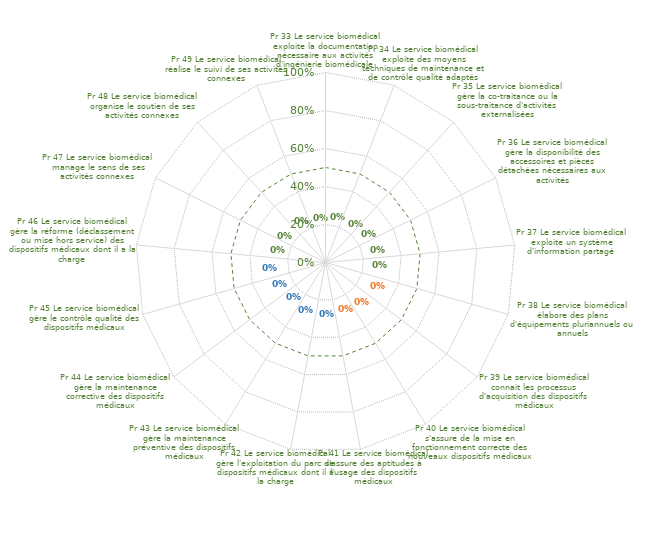
| Category | Graphes RADAR pour Résultats Globaux BPR | Limite ISO 17050 |
|---|---|---|
| Pr 33 Le service biomédical exploite la documentation nécessaire aux activités d'ingénierie biomédicale | 0 | 0.5 |
| Pr 34 Le service biomédical exploite des moyens techniques de maintenance et de contrôle qualité adaptés | 0 | 0.5 |
| Pr 35 Le service biomédical gère la co-traitance ou la sous-traitance d'activités externalisées | 0 | 0.5 |
| Pr 36 Le service biomédical gère la disponibilité des accessoires et pièces détachées nécessaires aux activités | 0 | 0.5 |
| Pr 37 Le service biomédical exploite un système d'information partagé  | 0 | 0.5 |
| Pr 38 Le service biomédical élabore des plans d'équipements pluriannuels ou annuels | 0 | 0.5 |
| Pr 39 Le service biomédical connait les processus d'acquisition des dispositifs médicaux | 0 | 0.5 |
| Pr 40 Le service biomédical s'assure de la mise en fonctionnement correcte des nouveaux dispositifs médicaux | 0 | 0.5 |
| Pr 41 Le service biomédical s'assure des aptitudes à l'usage des dispositifs médicaux | 0 | 0.5 |
| Pr 42 Le service biomédical gère l'exploitation du parc de dispositifs médicaux dont il a la charge | 0 | 0.5 |
| Pr 43 Le service biomédical gère la maintenance préventive des dispositifs médicaux | 0 | 0.5 |
| Pr 44 Le service biomédical gère la maintenance corrective des dispositifs médicaux | 0 | 0.5 |
| Pr 45 Le service biomédical gère le contrôle qualité des dispositifs médicaux | 0 | 0.5 |
| Pr 46 Le service biomédical gère la réforme (déclassement ou mise hors service) des dispositifs médicaux dont il a la charge | 0 | 0.5 |
| Pr 47 Le service biomédical manage le sens de ses activités connexes | 0 | 0.5 |
| Pr 48 Le service biomédical organise le soutien de ses activités connexes | 0 | 0.5 |
| Pr 49 Le service biomédical réalise le suivi de ses activités connexes | 0 | 0.5 |